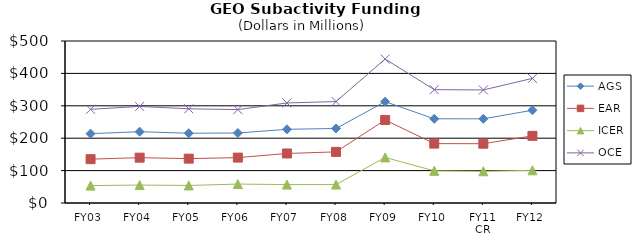
| Category | AGS | EAR | ICER | OCE |
|---|---|---|---|---|
| FY03 | 214.01 | 135.34 | 53.73 | 289.13 |
| FY04 | 220.04 | 139.93 | 55.37 | 298.06 |
| FY05 | 215.32 | 136.95 | 54.11 | 290.79 |
| FY06 | 216.09 | 140.12 | 58.37 | 288.25 |
| FY07 | 227.44 | 152.83 | 56.82 | 308.76 |
| FY08 | 230.03 | 157.82 | 56.96 | 313.06 |
| FY09 | 312.8 | 256.22 | 140.75 | 444.36 |
| FY10 | 259.87 | 183.26 | 99.27 | 349.88 |
| FY11
CR | 259.8 | 183 | 97.92 | 348.92 |
| FY12 | 286.33 | 207.27 | 100.92 | 384.64 |